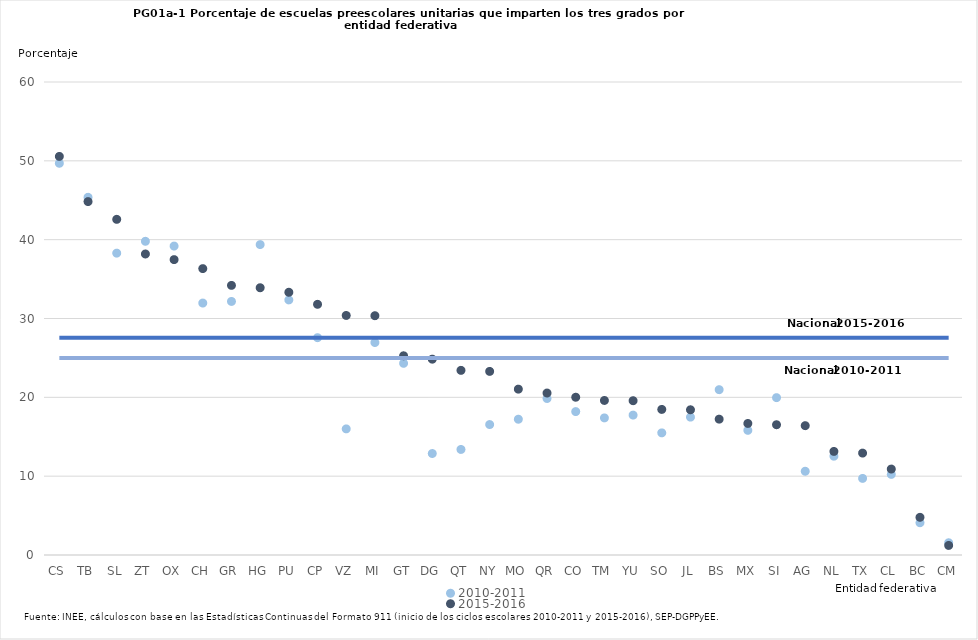
| Category | 2010-2011 | 2015-2016 | Series 2 | Series 3 |
|---|---|---|---|---|
| CS | 49.69 | 50.56 | 24.995 | 27.551 |
| TB | 45.374 | 44.829 | 24.995 | 27.551 |
| SL | 38.29 | 42.578 | 24.995 | 27.551 |
| ZT | 39.792 | 38.184 | 24.995 | 27.551 |
| OX | 39.186 | 37.468 | 24.995 | 27.551 |
| CH | 31.96 | 36.327 | 24.995 | 27.551 |
| GR | 32.165 | 34.2 | 24.995 | 27.551 |
| HG | 39.374 | 33.9 | 24.995 | 27.551 |
| PU | 32.357 | 33.327 | 24.995 | 27.551 |
| CP | 27.568 | 31.799 | 24.995 | 27.551 |
| VZ | 15.998 | 30.386 | 24.995 | 27.551 |
| MI | 26.95 | 30.354 | 24.995 | 27.551 |
| GT | 24.314 | 25.27 | 24.995 | 27.551 |
| DG | 12.873 | 24.842 | 24.995 | 27.551 |
| QT | 13.39 | 23.422 | 24.995 | 27.551 |
| NY | 16.546 | 23.291 | 24.995 | 27.551 |
| MO | 17.224 | 21.04 | 24.995 | 27.551 |
| QR | 19.852 | 20.544 | 24.995 | 27.551 |
| CO | 18.192 | 20.012 | 24.995 | 27.551 |
| TM | 17.391 | 19.604 | 24.995 | 27.551 |
| YU | 17.746 | 19.572 | 24.995 | 27.551 |
| SO | 15.493 | 18.467 | 24.995 | 27.551 |
| JL | 17.488 | 18.42 | 24.995 | 27.551 |
| BS | 20.972 | 17.233 | 24.995 | 27.551 |
| MX | 15.813 | 16.688 | 24.995 | 27.551 |
| SI | 19.959 | 16.525 | 24.995 | 27.551 |
| AG | 10.622 | 16.406 | 24.995 | 27.551 |
| NL | 12.535 | 13.139 | 24.995 | 27.551 |
| TX | 9.717 | 12.927 | 24.995 | 27.551 |
| CL | 10.224 | 10.9 | 24.995 | 27.551 |
| BC | 4.093 | 4.779 | 24.995 | 27.551 |
| CM | 1.553 | 1.214 | 24.995 | 27.551 |